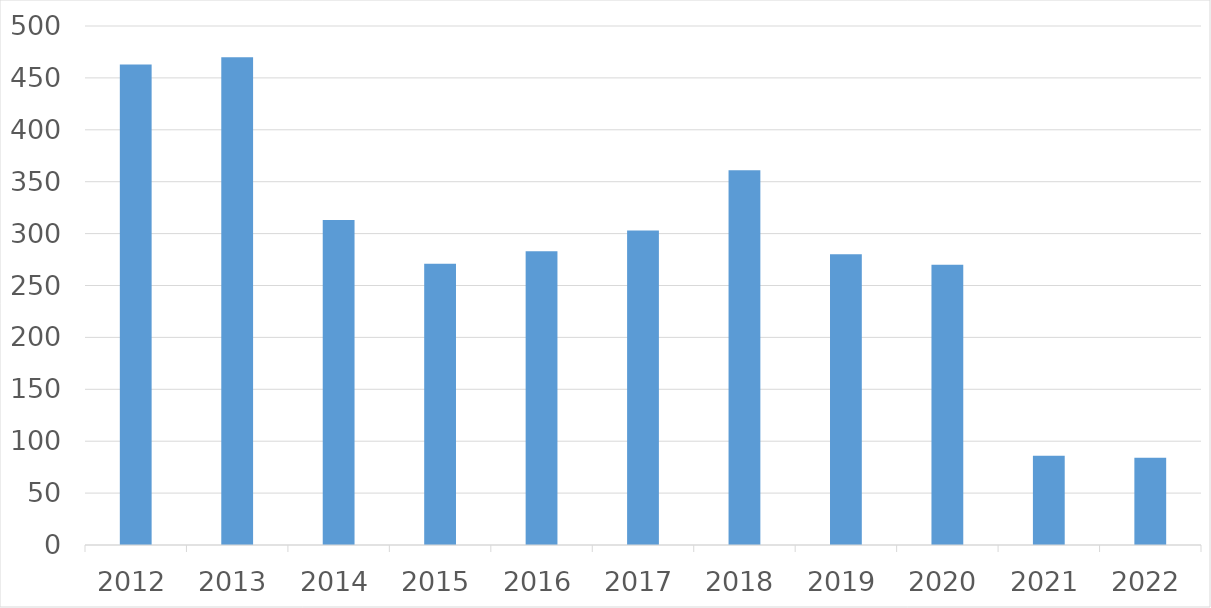
| Category | Series 0 |
|---|---|
| 2012 | 463 |
| 2013 | 470 |
| 2014 | 313 |
| 2015 | 271 |
| 2016 | 283 |
| 2017 | 303 |
| 2018 | 361 |
| 2019 | 280 |
| 2020 | 270 |
| 2021 | 86 |
| 2022 | 84 |